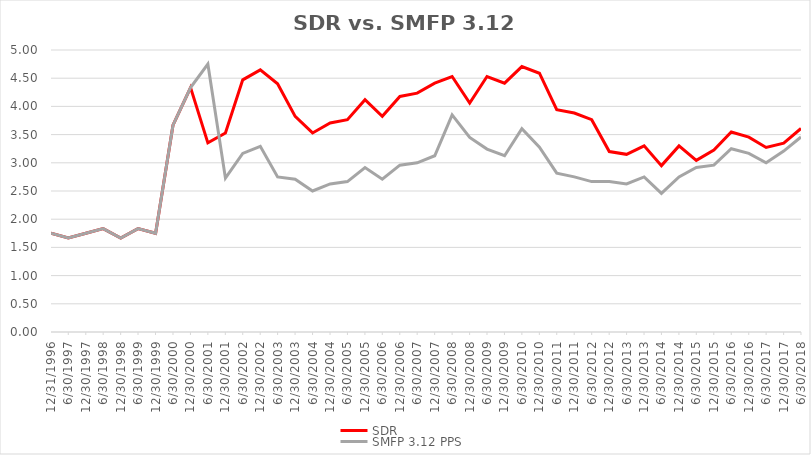
| Category | SDR | SMFP 3.12 PPS |
|---|---|---|
| 12/31/96 | 1.75 | 1.75 |
| 6/30/97 | 1.667 | 1.667 |
| 12/31/97 | 1.75 | 1.75 |
| 6/30/98 | 1.833 | 1.833 |
| 12/31/98 | 1.667 | 1.667 |
| 6/30/99 | 1.833 | 1.833 |
| 12/31/99 | 1.75 | 1.75 |
| 6/30/00 | 3.667 | 3.667 |
| 12/31/00 | 4.333 | 4.333 |
| 6/30/01 | 3.353 | 4.75 |
| 12/31/01 | 3.529 | 2.727 |
| 6/30/02 | 4.471 | 3.167 |
| 12/31/02 | 4.647 | 3.292 |
| 6/30/03 | 4.4 | 2.75 |
| 12/31/03 | 3.824 | 2.708 |
| 6/30/04 | 3.529 | 2.5 |
| 12/31/04 | 3.706 | 2.625 |
| 6/30/05 | 3.765 | 2.667 |
| 12/31/05 | 4.118 | 2.917 |
| 6/30/06 | 3.824 | 2.708 |
| 12/31/06 | 4.176 | 2.958 |
| 6/30/07 | 4.235 | 3 |
| 12/31/07 | 4.412 | 3.125 |
| 6/30/08 | 4.529 | 3.85 |
| 12/31/08 | 4.059 | 3.45 |
| 6/30/09 | 4.529 | 3.244 |
| 12/31/09 | 4.412 | 3.125 |
| 6/30/10 | 4.706 | 3.605 |
| 12/31/10 | 4.588 | 3.278 |
| 6/30/11 | 3.941 | 2.816 |
| 12/31/11 | 3.882 | 2.75 |
| 6/30/12 | 3.765 | 2.667 |
| 12/31/12 | 3.2 | 2.667 |
| 6/30/13 | 3.15 | 2.625 |
| 12/31/13 | 3.3 | 2.75 |
| 6/30/14 | 2.95 | 2.458 |
| 12/31/14 | 3.3 | 2.75 |
| 6/30/15 | 3.043 | 2.917 |
| 12/31/15 | 3.227 | 2.958 |
| 6/30/16 | 3.545 | 3.25 |
| 12/31/16 | 3.455 | 3.167 |
| 6/30/17 | 3.273 | 3 |
| 12/31/17 | 3.348 | 3.208 |
| 6/30/18 | 3.609 | 3.458 |